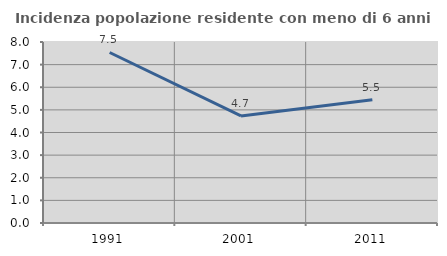
| Category | Incidenza popolazione residente con meno di 6 anni |
|---|---|
| 1991.0 | 7.537 |
| 2001.0 | 4.734 |
| 2011.0 | 5.451 |